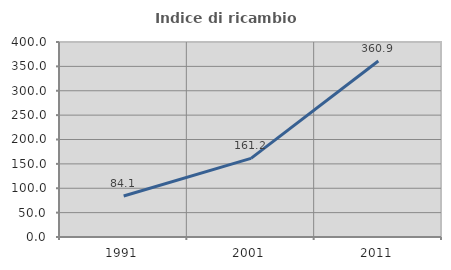
| Category | Indice di ricambio occupazionale  |
|---|---|
| 1991.0 | 84.133 |
| 2001.0 | 161.194 |
| 2011.0 | 360.927 |